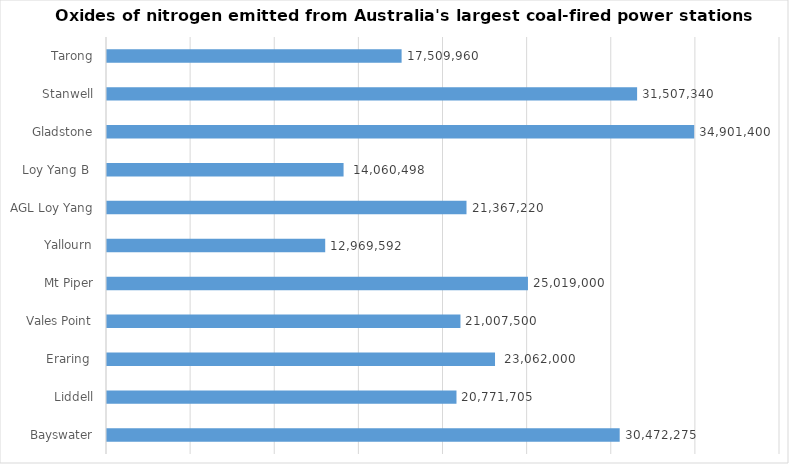
| Category | Series 0 |
|---|---|
| Bayswater | 30472274.6 |
| Liddell | 20771705.024 |
| Eraring | 23062000 |
| Vales Point | 21007500 |
| Mt Piper | 25019000 |
| Yallourn | 12969592 |
| AGL Loy Yang | 21367219.689 |
| Loy Yang B | 14060498 |
| Gladstone | 34901400 |
| Stanwell | 31507340 |
| Tarong | 17509960 |